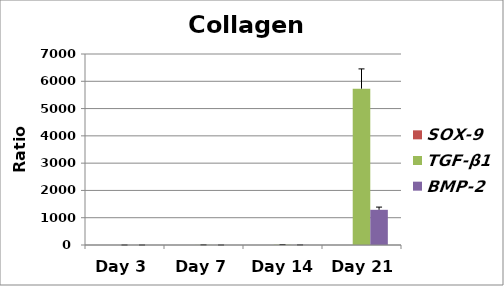
| Category | SOX-9 | TGF-β1 | BMP-2 |
|---|---|---|---|
| Day 3 | 0 | 0.005 | 0 |
| Day 7 | 0.561 | 3.793 | 0.194 |
| Day 14 | 0.03 | 9.619 | 2.622 |
| Day 21 | 0.426 | 5729.778 | 1289.805 |